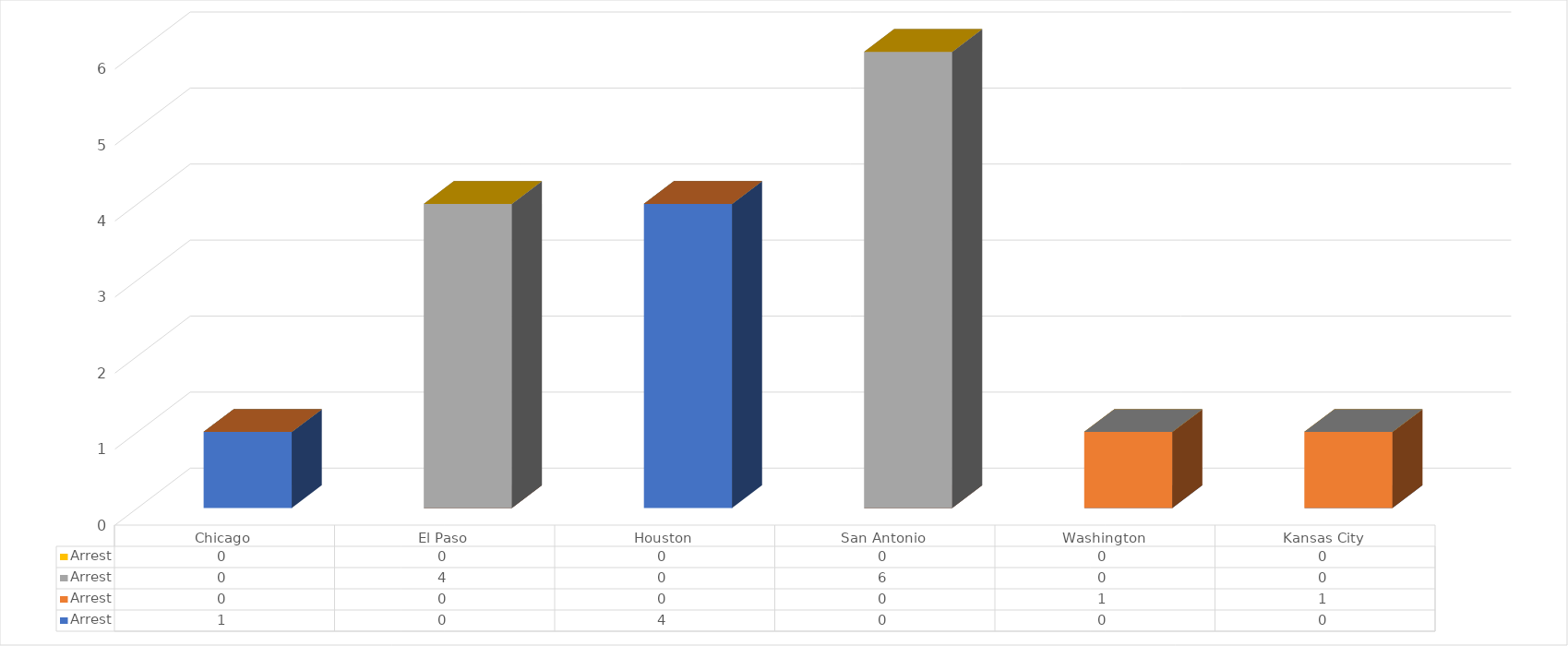
| Category | Sum of Other Priority - Arrest | Sum of Public Safety - Arrest | Sum of Border Security - Arrest | Sum of National Security - Arrest |
|---|---|---|---|---|
| Chicago | 1 | 0 | 0 | 0 |
| El Paso | 0 | 0 | 4 | 0 |
| Houston | 4 | 0 | 0 | 0 |
| San Antonio | 0 | 0 | 6 | 0 |
| Washington | 0 | 1 | 0 | 0 |
| Kansas City | 0 | 1 | 0 | 0 |